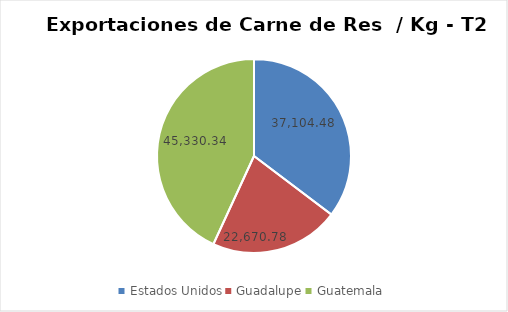
| Category | Series 0 |
|---|---|
| Estados Unidos | 37104.48 |
| Guadalupe | 22670.78 |
| Guatemala | 45330.34 |